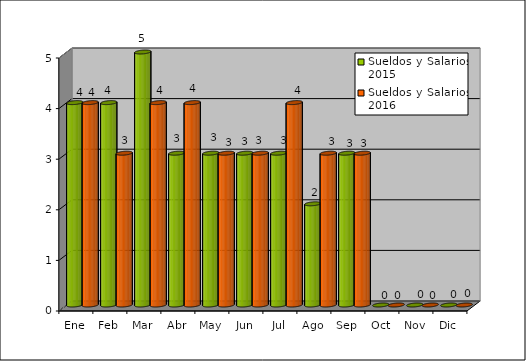
| Category | Sueldos y Salarios 2015 | Sueldos y Salarios 2016 |
|---|---|---|
| Ene | 4 | 4 |
| Feb | 4 | 3 |
| Mar | 5 | 4 |
| Abr | 3 | 4 |
| May | 3 | 3 |
| Jun | 3 | 3 |
| Jul | 3 | 4 |
| Ago | 2 | 3 |
| Sep | 3 | 3 |
| Oct | 0 | 0 |
| Nov | 0 | 0 |
| Dic | 0 | 0 |